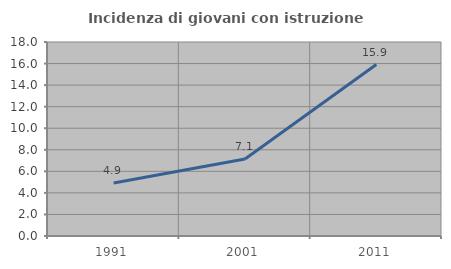
| Category | Incidenza di giovani con istruzione universitaria |
|---|---|
| 1991.0 | 4.918 |
| 2001.0 | 7.143 |
| 2011.0 | 15.909 |